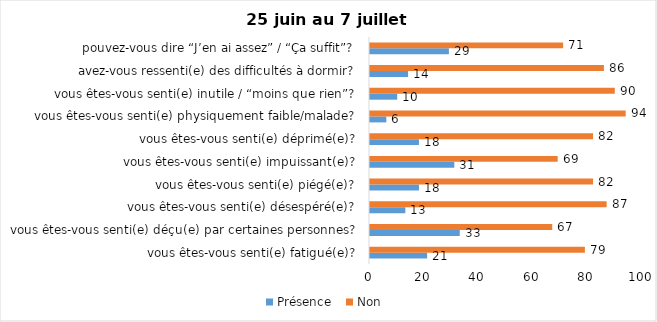
| Category | Présence | Non |
|---|---|---|
| vous êtes-vous senti(e) fatigué(e)? | 21 | 79 |
| vous êtes-vous senti(e) déçu(e) par certaines personnes? | 33 | 67 |
| vous êtes-vous senti(e) désespéré(e)? | 13 | 87 |
| vous êtes-vous senti(e) piégé(e)? | 18 | 82 |
| vous êtes-vous senti(e) impuissant(e)? | 31 | 69 |
| vous êtes-vous senti(e) déprimé(e)? | 18 | 82 |
| vous êtes-vous senti(e) physiquement faible/malade? | 6 | 94 |
| vous êtes-vous senti(e) inutile / “moins que rien”? | 10 | 90 |
| avez-vous ressenti(e) des difficultés à dormir? | 14 | 86 |
| pouvez-vous dire “J’en ai assez” / “Ça suffit”? | 29 | 71 |